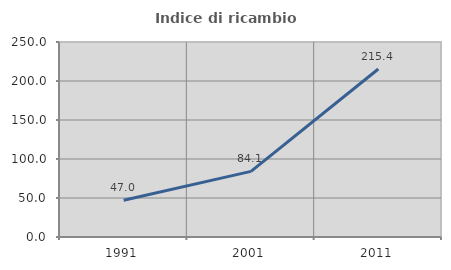
| Category | Indice di ricambio occupazionale  |
|---|---|
| 1991.0 | 47.049 |
| 2001.0 | 84.13 |
| 2011.0 | 215.408 |